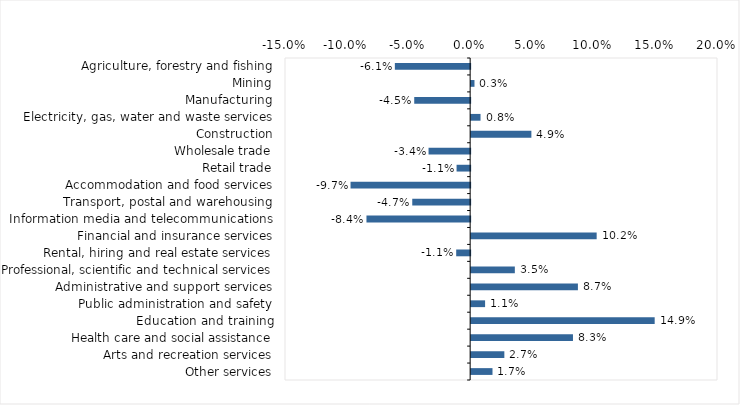
| Category | This week |
|---|---|
| Agriculture, forestry and fishing | -0.061 |
| Mining | 0.003 |
| Manufacturing | -0.045 |
| Electricity, gas, water and waste services | 0.008 |
| Construction | 0.049 |
| Wholesale trade | -0.034 |
| Retail trade | -0.011 |
| Accommodation and food services | -0.097 |
| Transport, postal and warehousing | -0.047 |
| Information media and telecommunications | -0.084 |
| Financial and insurance services | 0.102 |
| Rental, hiring and real estate services | -0.011 |
| Professional, scientific and technical services | 0.035 |
| Administrative and support services | 0.086 |
| Public administration and safety | 0.011 |
| Education and training | 0.149 |
| Health care and social assistance | 0.082 |
| Arts and recreation services | 0.027 |
| Other services | 0.017 |